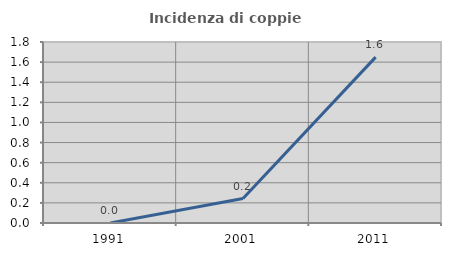
| Category | Incidenza di coppie miste |
|---|---|
| 1991.0 | 0 |
| 2001.0 | 0.243 |
| 2011.0 | 1.65 |